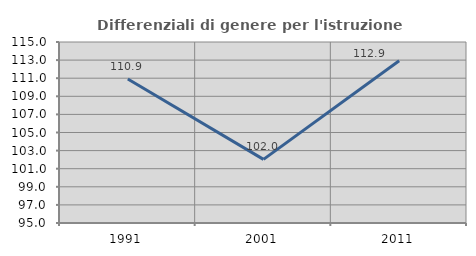
| Category | Differenziali di genere per l'istruzione superiore |
|---|---|
| 1991.0 | 110.909 |
| 2001.0 | 102.032 |
| 2011.0 | 112.925 |